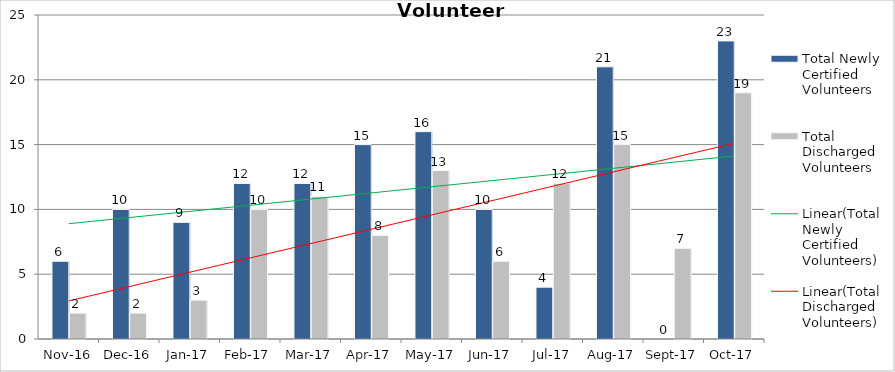
| Category | Total Newly Certified Volunteers | Total Discharged Volunteers |
|---|---|---|
| 2016-11-01 | 6 | 2 |
| 2016-12-01 | 10 | 2 |
| 2017-01-01 | 9 | 3 |
| 2017-02-01 | 12 | 10 |
| 2017-03-01 | 12 | 11 |
| 2017-04-01 | 15 | 8 |
| 2017-05-01 | 16 | 13 |
| 2017-06-01 | 10 | 6 |
| 2017-07-01 | 4 | 12 |
| 2017-08-01 | 21 | 15 |
| 2017-09-01 | 0 | 7 |
| 2017-10-01 | 23 | 19 |